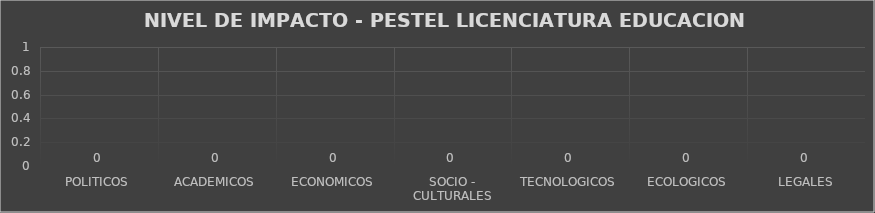
| Category | Series 0 |
|---|---|
| POLITICOS | 0 |
| ACADEMICOS | 0 |
| ECONOMICOS | 0 |
| SOCIO - CULTURALES | 0 |
| TECNOLOGICOS | 0 |
| ECOLOGICOS | 0 |
| LEGALES | 0 |